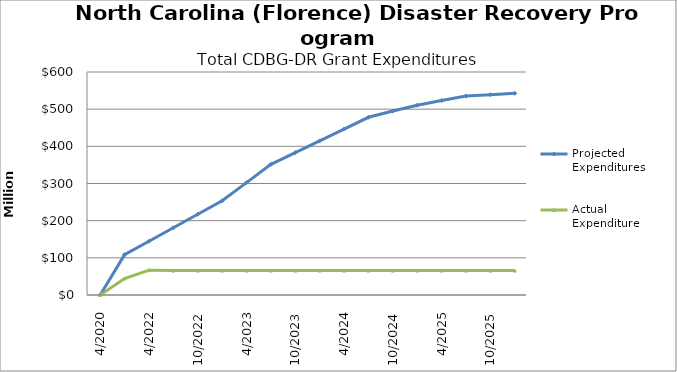
| Category | Projected Expenditures | Actual Expenditure |
|---|---|---|
| 4/2020 | 0 | 0 |
| 1/2022 | 108319145 | 44439532.84 |
| 4/2022 | 144608813.68 | 66854885.84 |
| 7/2022 | 180898482.36 | 65694639.15 |
| 10/2022 | 217188151.04 | 65694639.15 |
| 1/2023 | 253477819.72 | 65694639.15 |
| 4/2023 | 302481427.28 | 65694639.15 |
| 7/2023 | 351534989.6 | 65694639.15 |
| 10/2023 | 383142519.92 | 65694639.15 |
| 1/2024 | 414750050.24 | 65694639.15 |
| 4/2024 | 446457580.56 | 65694639.15 |
| 7/2024 | 478165110.88 | 65694639.15 |
| 10/2024 | 494949931.2 | 65694639.15 |
| 1/2025 | 510548131.52 | 65694639.15 |
| 4/2025 | 523359551.84 | 65694639.15 |
| 7/2025 | 535244532.16 | 65694639.15 |
| 10/2025 | 538989852.48 | 65694639.15 |
| 1/2026 | 542643999.8 | 65694639.15 |